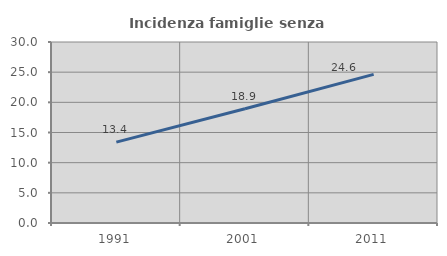
| Category | Incidenza famiglie senza nuclei |
|---|---|
| 1991.0 | 13.398 |
| 2001.0 | 18.933 |
| 2011.0 | 24.639 |